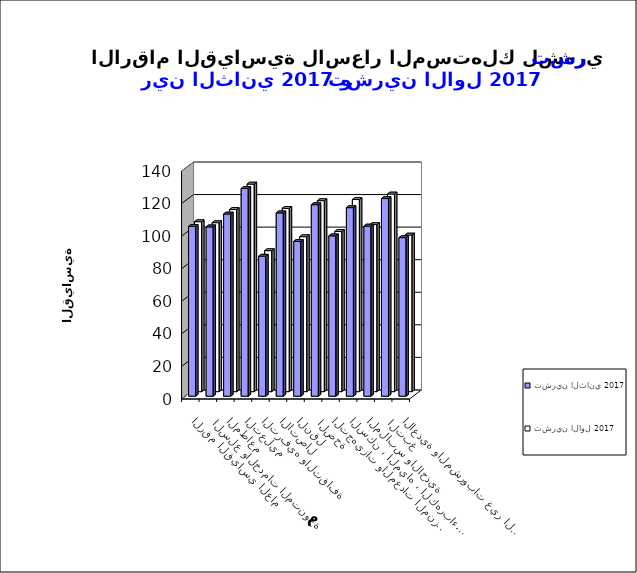
| Category | تشرين الثاني 2017      | تشرين الاول 2017       |
|---|---|---|
| الاغذية والمشروبات غير الكحولية | 97.4 | 96.2 |
|  التبغ | 121.4 | 121.4 |
| الملابس والاحذية | 104.5 | 102.6 |
| السكن ، المياه ، الكهرباء، الغاز  | 115.8 | 118 |
| التجهيزات والمعدات المنزلية والصيانة | 98.5 | 98.4 |
|  الصحة | 117.6 | 117.3 |
| النقل | 95.1 | 95.2 |
| الاتصال | 112.6 | 112.6 |
| الترفيه والثقافة | 86 | 86.6 |
| التعليم | 127.6 | 127.5 |
| المطاعم  | 111.9 | 111.9 |
|  السلع والخدمات المتنوعة | 104 | 103.8 |
| الرقم القياسي العام | 104.3 | 104.4 |